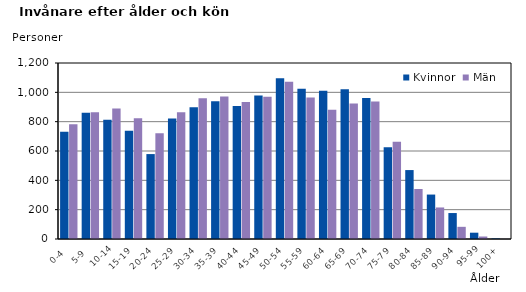
| Category | Kvinnor | Män |
|---|---|---|
|   0-4  | 732 | 782 |
|   5-9  | 861 | 865 |
| 10-14 | 813 | 889 |
| 15-19  | 738 | 823 |
| 20-24  | 579 | 721 |
| 25-29  | 821 | 864 |
| 30-34  | 898 | 960 |
| 35-39  | 940 | 971 |
| 40-44  | 907 | 934 |
| 45-49  | 979 | 970 |
| 50-54  | 1096 | 1072 |
| 55-59  | 1025 | 965 |
| 60-64  | 1011 | 882 |
| 65-69  | 1021 | 924 |
| 70-74  | 962 | 937 |
| 75-79  | 625 | 663 |
| 80-84  | 470 | 341 |
| 85-89  | 303 | 215 |
| 90-94  | 177 | 83 |
| 95-99 | 43 | 17 |
| 100+ | 4 | 1 |